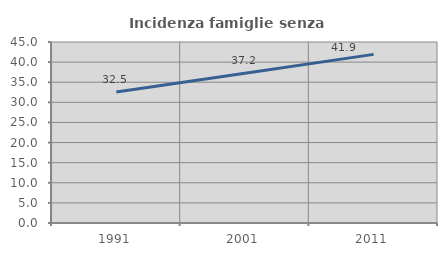
| Category | Incidenza famiglie senza nuclei |
|---|---|
| 1991.0 | 32.549 |
| 2001.0 | 37.246 |
| 2011.0 | 41.922 |